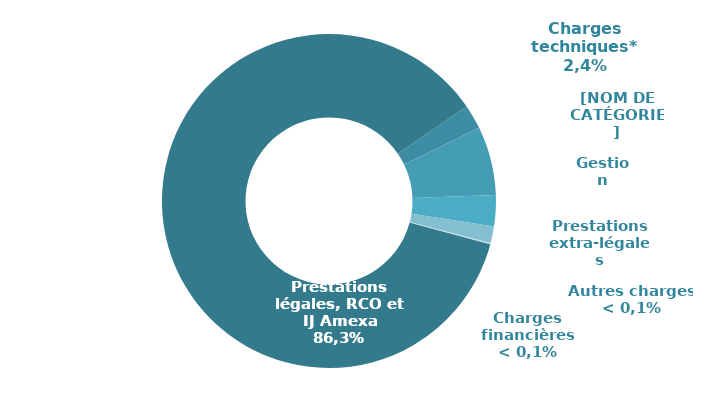
| Category | Series 0 |
|---|---|
| Prestations légales | 14352.602 |
| Charges techniques* | 393.851 |
| Dotations aux provisions | 1104.669 |
| Gestion | 502.386 |
| Prestations extra-légales | 266.964 |
| Autres charges | 10.627 |
| Charges financières | 9.541 |